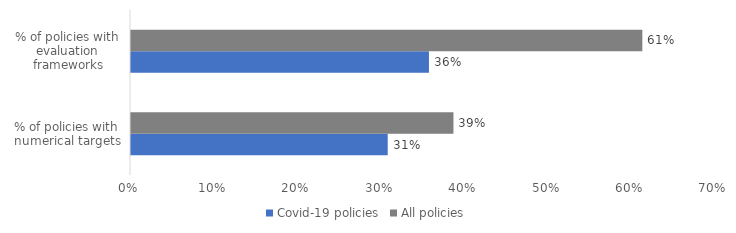
| Category | Covid-19 policies | All policies |
|---|---|---|
| % of policies with numerical targets | 0.308 | 0.387 |
| % of policies with evaluation frameworks | 0.357 | 0.613 |